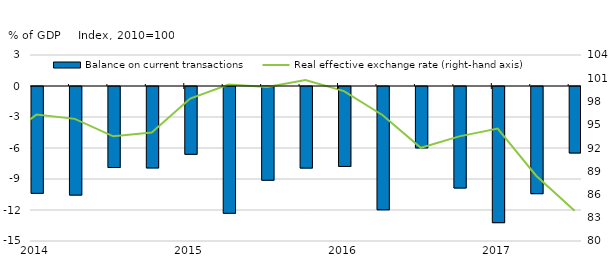
| Category | Balance on current transactions |
|---|---|
| 2010-03-01 | -7.433 |
| 2010-06-01 | -8.225 |
| 2010-09-01 | -0.489 |
| 2010-12-01 | -3.108 |
| 2011-03-01 | -6.188 |
| 2011-06-01 | -8.313 |
| 2011-09-01 | -5.518 |
| 2011-12-01 | -9.461 |
| 2012-03-01 | -9.384 |
| 2012-06-01 | -9.68 |
| 2012-09-01 | -7.985 |
| 2012-12-01 | -6.129 |
| 2013-03-01 | -7.637 |
| 2013-06-01 | -10.72 |
| 2013-09-01 | -4.834 |
| 2013-12-01 | -10.324 |
| 2014-03-01 | -10.339 |
| 2014-06-01 | -10.51 |
| 2014-09-01 | -7.84 |
| 2014-12-01 | -7.878 |
| 2015-03-01 | -6.563 |
| 2015-06-01 | -12.269 |
| 2015-09-01 | -9.071 |
| 2015-12-01 | -7.895 |
| 2016-03-01 | -7.735 |
| 2016-06-01 | -11.933 |
| 2016-09-01 | -5.94 |
| 2016-12-01 | -9.825 |
| 2017-03-01 | -13.176 |
| 2017-06-01 | -10.369 |
| 2017-09-01 | -6.436 |